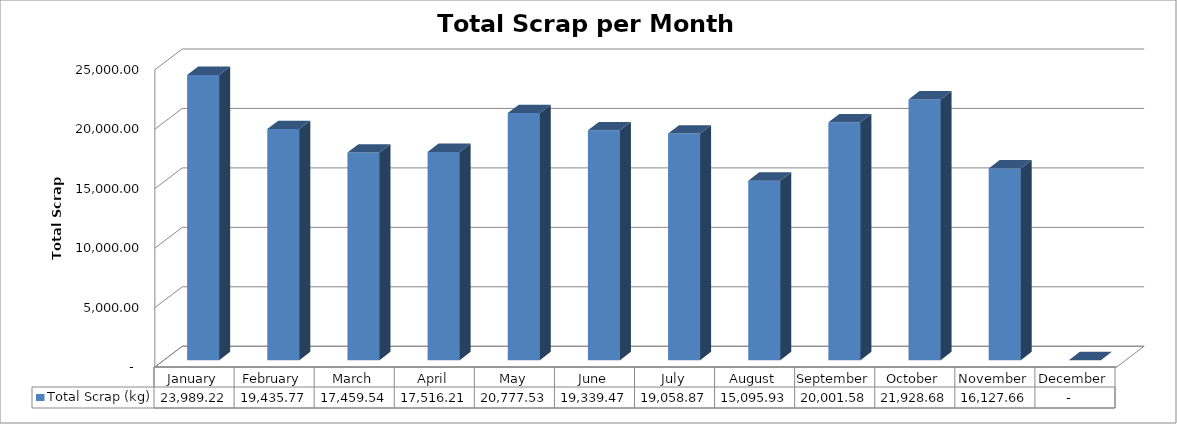
| Category | Total Scrap (kg) |
|---|---|
| January | 23989.221 |
| February | 19435.767 |
| March | 17459.536 |
| April | 17516.215 |
| May | 20777.531 |
| June | 19339.466 |
| July | 19058.87 |
| August | 15095.928 |
| September | 20001.578 |
| October | 21928.677 |
| November | 16127.659 |
| December | 0 |